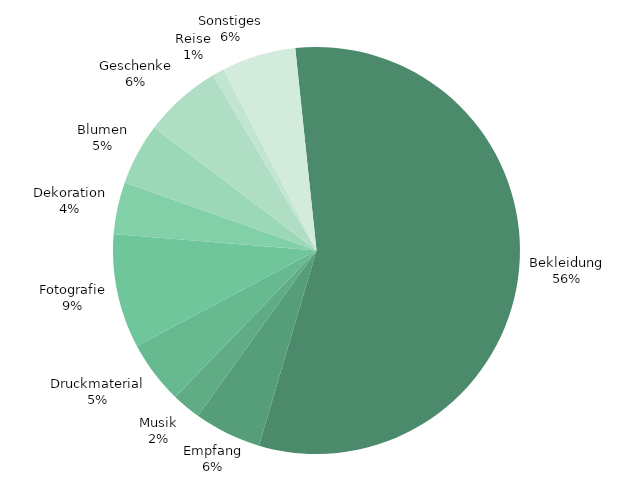
| Category | TATSÄCHLICH |
|---|---|
| Bekleidung | 9770 |
| Empfang | 928 |
| Musik | 400 |
| Druckmaterial | 870 |
| Fotografie | 1575 |
| Dekoration | 720 |
| Blumen | 850 |
| Geschenke | 1075 |
| Reise | 165 |
| Sonstiges | 1021 |